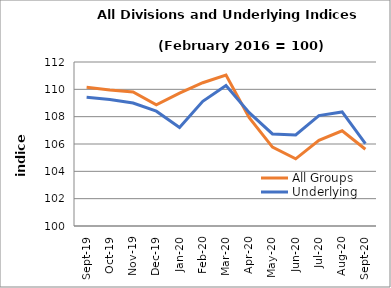
| Category | All Groups | Underlying |
|---|---|---|
| 2019-09-01 | 110.148 | 109.423 |
| 2019-10-01 | 109.943 | 109.256 |
| 2019-11-01 | 109.811 | 108.998 |
| 2019-12-01 | 108.864 | 108.4 |
| 2020-01-01 | 109.718 | 107.211 |
| 2020-02-01 | 110.483 | 109.121 |
| 2020-03-01 | 111.043 | 110.276 |
| 2020-04-01 | 107.93 | 108.297 |
| 2020-05-01 | 105.77 | 106.735 |
| 2020-06-01 | 104.913 | 106.661 |
| 2020-07-01 | 106.265 | 108.077 |
| 2020-08-01 | 106.963 | 108.349 |
| 2020-09-01 | 105.614 | 106.027 |